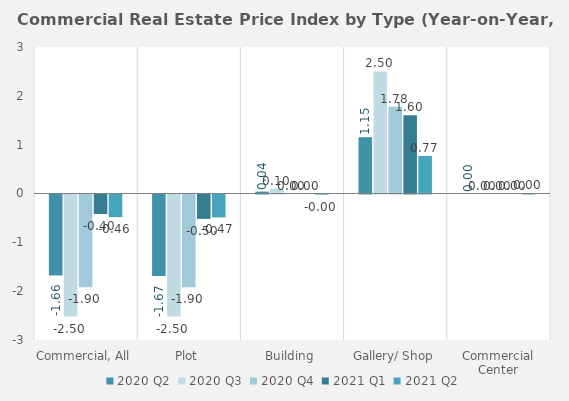
| Category | 2020 | 2021 |
|---|---|---|
| Commercial, All | -1.9 | -0.464 |
| Plot | -1.9 | -0.47 |
| Building | 0 | -0.004 |
| Gallery/ Shop | 1.777 | 0.77 |
| Commercial Center | 0 | 0.002 |